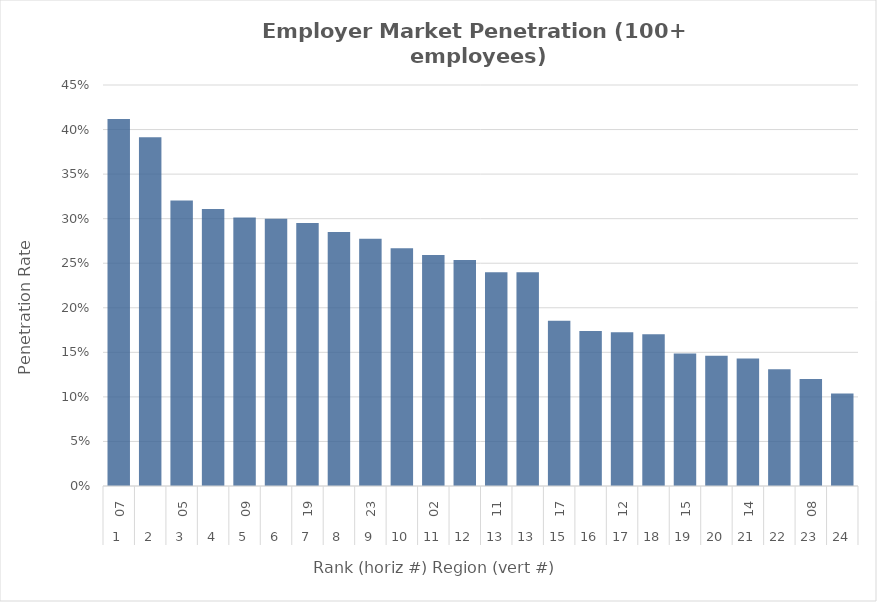
| Category | Rate |
|---|---|
| 0 | 0.412 |
| 1 | 0.391 |
| 2 | 0.32 |
| 3 | 0.311 |
| 4 | 0.301 |
| 5 | 0.3 |
| 6 | 0.295 |
| 7 | 0.285 |
| 8 | 0.277 |
| 9 | 0.267 |
| 10 | 0.259 |
| 11 | 0.254 |
| 12 | 0.24 |
| 13 | 0.24 |
| 14 | 0.185 |
| 15 | 0.174 |
| 16 | 0.172 |
| 17 | 0.17 |
| 18 | 0.149 |
| 19 | 0.146 |
| 20 | 0.143 |
| 21 | 0.131 |
| 22 | 0.12 |
| 23 | 0.104 |